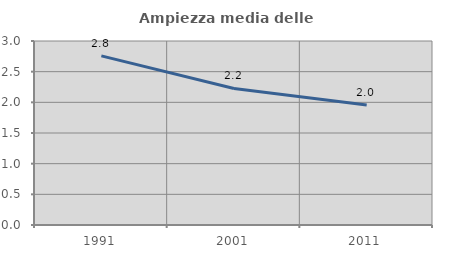
| Category | Ampiezza media delle famiglie |
|---|---|
| 1991.0 | 2.757 |
| 2001.0 | 2.226 |
| 2011.0 | 1.958 |